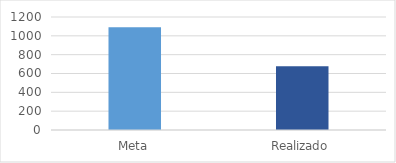
| Category | Series 0 |
|---|---|
| Meta | 1090 |
| Realizado | 678 |